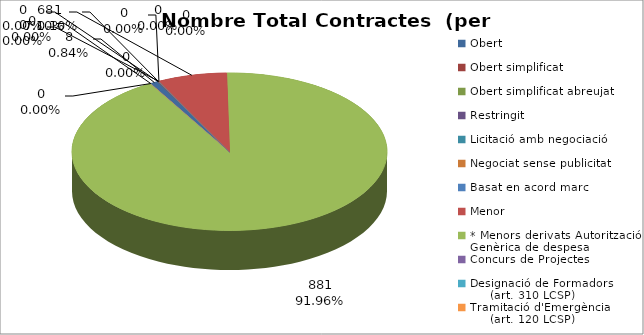
| Category | Nombre Total Contractes |
|---|---|
| Obert | 8 |
| Obert simplificat | 0 |
| Obert simplificat abreujat | 1 |
| Restringit | 0 |
| Licitació amb negociació | 0 |
| Negociat sense publicitat | 0 |
| Basat en acord marc | 0 |
| Menor | 68 |
| * Menors derivats Autorització Genèrica de despesa | 881 |
| Concurs de Projectes | 0 |
| Designació de Formadors
     (art. 310 LCSP) | 0 |
| Tramitació d'Emergència
     (art. 120 LCSP) | 0 |